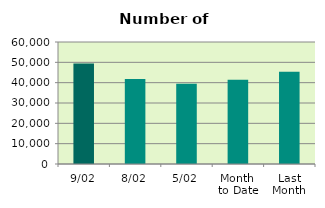
| Category | Series 0 |
|---|---|
| 9/02 | 49438 |
| 8/02 | 41790 |
| 5/02 | 39516 |
| Month 
to Date | 41377.143 |
| Last
Month | 45378.8 |